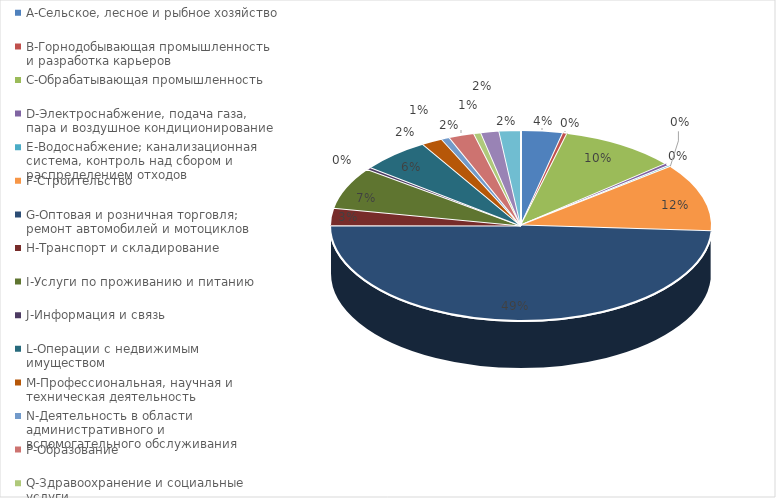
| Category | Series 0 |
|---|---|
| A-Сельское, лесное и рыбное хозяйство | 0.036 |
| B-Горнодобывающая промышленность и разработка карьеров | 0.004 |
| C-Обрабатывающая промышленность | 0.098 |
| D-Электроснабжение, подача газа, пара и воздушное кондиционирование | 0.004 |
| E-Водоснабжение; канализационная система, контроль над сбором и распределением отходов | 0.002 |
| F-Строительство | 0.116 |
| G-Оптовая и розничная торговля; ремонт автомобилей и мотоциклов | 0.491 |
| H-Транспорт и складирование | 0.029 |
| I-Услуги по проживанию и питанию | 0.071 |
| J-Информация и связь | 0.004 |
| L-Операции с недвижимым имуществом | 0.059 |
| M-Профессиональная, научная и техническая деятельность | 0.018 |
| N-Деятельность в области административного и вспомогательного обслуживания | 0.007 |
| P-Образование | 0.022 |
| Q-Здравоохранение и социальные услуги | 0.006 |
| R-Искусство, развлечения и отдых | 0.015 |
| S-Предоставление прочих видов услуг | 0.018 |